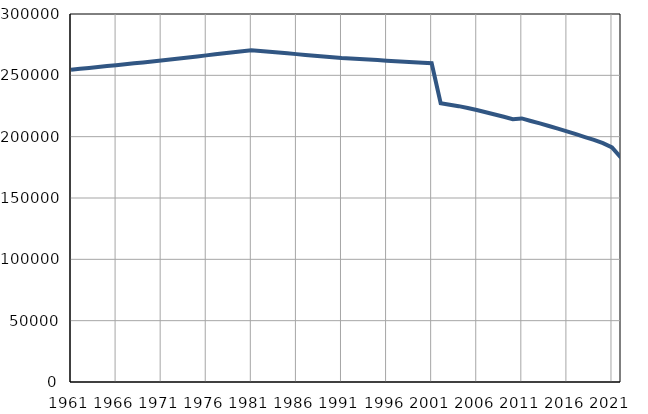
| Category | Population
size |
|---|---|
| 1961.0 | 254521 |
| 1962.0 | 255274 |
| 1963.0 | 256028 |
| 1964.0 | 256781 |
| 1965.0 | 257535 |
| 1966.0 | 258288 |
| 1967.0 | 259041 |
| 1968.0 | 259795 |
| 1969.0 | 260548 |
| 1970.0 | 261302 |
| 1971.0 | 262055 |
| 1972.0 | 262897 |
| 1973.0 | 263737 |
| 1974.0 | 264581 |
| 1975.0 | 265423 |
| 1976.0 | 266265 |
| 1977.0 | 267106 |
| 1978.0 | 267948 |
| 1979.0 | 268790 |
| 1980.0 | 269632 |
| 1981.0 | 270474 |
| 1982.0 | 269837 |
| 1983.0 | 269201 |
| 1984.0 | 268564 |
| 1985.0 | 267928 |
| 1986.0 | 267291 |
| 1987.0 | 266654 |
| 1988.0 | 266018 |
| 1989.0 | 265381 |
| 1990.0 | 264745 |
| 1991.0 | 264108 |
| 1992.0 | 263684 |
| 1993.0 | 263259 |
| 1994.0 | 262835 |
| 1995.0 | 262410 |
| 1996.0 | 261986 |
| 1997.0 | 261561 |
| 1998.0 | 261137 |
| 1999.0 | 260712 |
| 2000.0 | 260288 |
| 2001.0 | 259863 |
| 2002.0 | 227335 |
| 2003.0 | 226086 |
| 2004.0 | 224874 |
| 2005.0 | 223391 |
| 2006.0 | 221704 |
| 2007.0 | 219934 |
| 2008.0 | 218062 |
| 2009.0 | 216186 |
| 2010.0 | 214260 |
| 2011.0 | 214872 |
| 2012.0 | 212808 |
| 2013.0 | 210795 |
| 2014.0 | 208683 |
| 2015.0 | 206491 |
| 2016.0 | 204369 |
| 2017.0 | 202025 |
| 2018.0 | 199698 |
| 2019.0 | 197361 |
| 2020.0 | 194676 |
| 2021.0 | 191260 |
| 2022.0 | 182913 |